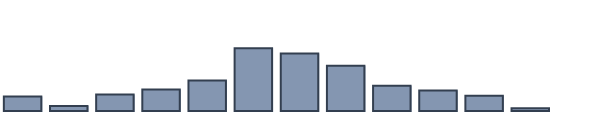
| Category | Series 0 |
|---|---|
| 0 | 4.6 |
| 1 | 1.6 |
| 2 | 5.2 |
| 3 | 6.8 |
| 4 | 9.6 |
| 5 | 19.8 |
| 6 | 18.1 |
| 7 | 14.3 |
| 8 | 8 |
| 9 | 6.5 |
| 10 | 4.8 |
| 11 | 0.9 |
| 12 | 0 |